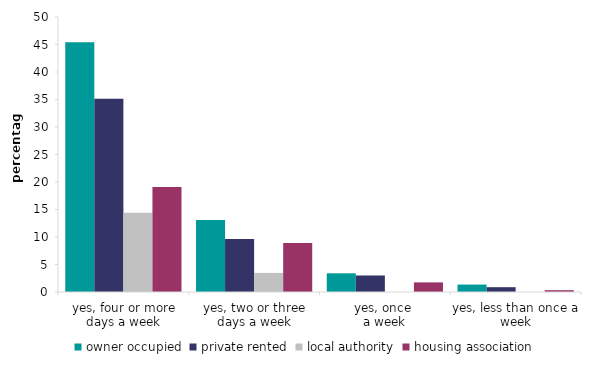
| Category | owner occupied | private rented | local authority | housing association |
|---|---|---|---|---|
| yes, four or more days a week | 45.422 | 35.133 | 14.401 | 19.1 |
| yes, two or three days a week | 13.083 | 9.653 | 3.475 | 8.925 |
| yes, once 
a week | 3.4 | 3 | 0 | 1.747 |
| yes, less than once a week | 1.35 | 0.875 | 0 | 0.331 |